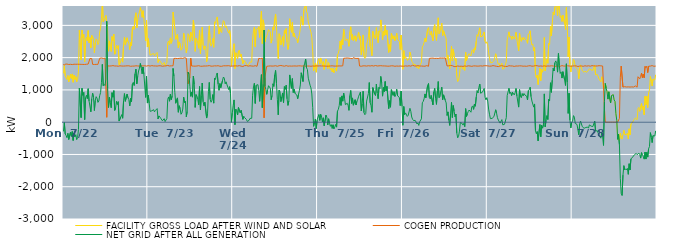
| Category | FACILITY GROSS LOAD AFTER WIND AND SOLAR | COGEN PRODUCTION | NET GRID AFTER ALL GENERATION |
|---|---|---|---|
|  Mon  7/22 | 1513 | 1799 | -286 |
|  Mon  7/22 | 1753 | 1766 | -13 |
|  Mon  7/22 | 1435 | 1798 | -363 |
|  Mon  7/22 | 1375 | 1789 | -414 |
|  Mon  7/22 | 1321 | 1801 | -480 |
|  Mon  7/22 | 1447 | 1792 | -345 |
|  Mon  7/22 | 1251 | 1787 | -536 |
|  Mon  7/22 | 1234 | 1789 | -555 |
|  Mon  7/22 | 1483 | 1793 | -310 |
|  Mon  7/22 | 1354 | 1793 | -439 |
|  Mon  7/22 | 1495 | 1785 | -290 |
|  Mon  7/22 | 1237 | 1804 | -567 |
|  Mon  7/22 | 1457 | 1796 | -339 |
|  Mon  7/22 | 1324 | 1780 | -456 |
|  Mon  7/22 | 1408 | 1794 | -386 |
|  Mon  7/22 | 1247 | 1789 | -542 |
|  Mon  7/22 | 1316 | 1796 | -480 |
|  Mon  7/22 | 1578 | 1802 | -224 |
|  Mon  7/22 | 2848 | 1794 | 1054 |
|  Mon  7/22 | 2853 | 1793 | 1060 |
|  Mon  7/22 | 1934 | 1792 | 142 |
|  Mon  7/22 | 2853 | 1804 | 1049 |
|  Mon  7/22 | 2622 | 1789 | 833 |
|  Mon  7/22 | 2720 | 1801 | 919 |
|  Mon  7/22 | 1869 | 1788 | 81 |
|  Mon  7/22 | 2543 | 1793 | 750 |
|  Mon  7/22 | 2630 | 1795 | 835 |
|  Mon  7/22 | 2523 | 1794 | 729 |
|  Mon  7/22 | 2838 | 1801 | 1037 |
|  Mon  7/22 | 2458 | 1804 | 654 |
|  Mon  7/22 | 2621 | 1974 | 647 |
|  Mon  7/22 | 2307 | 1985 | 322 |
|  Mon  7/22 | 2690 | 1972 | 718 |
|  Mon  7/22 | 2690 | 1792 | 898 |
|  Mon  7/22 | 2570 | 1797 | 773 |
|  Mon  7/22 | 2149 | 1788 | 361 |
|  Mon  7/22 | 2463 | 1785 | 678 |
|  Mon  7/22 | 2581 | 1791 | 790 |
|  Mon  7/22 | 2537 | 1794 | 743 |
|  Mon  7/22 | 2405 | 1791 | 614 |
|  Mon  7/22 | 2467 | 1813 | 654 |
|  Mon  7/22 | 2799 | 1979 | 820 |
|  Mon  7/22 | 2909 | 1992 | 917 |
|  Mon  7/22 | 3211 | 1990 | 1221 |
|  Mon  7/22 | 3782 | 1991 | 1791 |
|  Mon  7/22 | 3106 | 1976 | 1130 |
|  Mon  7/22 | 3150 | 1982 | 1168 |
|  Mon  7/22 | 3120 | 1984 | 1136 |
|  Mon  7/22 | 3306 | 1970 | 1336 |
|  Mon  7/22 | 3278 | 151 | 3127 |
|  Mon  7/22 | 2805 | 1746 | 1059 |
|  Mon  7/22 | 2199 | 1745 | 454 |
|  Mon  7/22 | 2518 | 1741 | 777 |
|  Mon  7/22 | 2359 | 1755 | 604 |
|  Mon  7/22 | 2191 | 1743 | 448 |
|  Mon  7/22 | 2653 | 1738 | 915 |
|  Mon  7/22 | 2527 | 1753 | 774 |
|  Mon  7/22 | 2727 | 1750 | 977 |
|  Mon  7/22 | 2106 | 1741 | 365 |
|  Mon  7/22 | 2172 | 1732 | 440 |
|  Mon  7/22 | 2382 | 1741 | 641 |
|  Mon  7/22 | 2286 | 1739 | 547 |
|  Mon  7/22 | 2372 | 1734 | 638 |
|  Mon  7/22 | 1775 | 1740 | 35 |
|  Mon  7/22 | 1778 | 1747 | 31 |
|  Mon  7/22 | 1903 | 1732 | 171 |
|  Mon  7/22 | 1976 | 1740 | 236 |
|  Mon  7/22 | 1859 | 1738 | 121 |
|  Mon  7/22 | 2398 | 1738 | 660 |
|  Mon  7/22 | 2629 | 1743 | 886 |
|  Mon  7/22 | 2388 | 1742 | 646 |
|  Mon  7/22 | 2384 | 1749 | 635 |
|  Mon  7/22 | 2615 | 1746 | 869 |
|  Mon  7/22 | 2497 | 1740 | 757 |
|  Mon  7/22 | 2449 | 1747 | 702 |
|  Mon  7/22 | 2249 | 1747 | 502 |
|  Mon  7/22 | 2468 | 1732 | 736 |
|  Mon  7/22 | 2372 | 1733 | 639 |
|  Mon  7/22 | 2915 | 1737 | 1178 |
|  Mon  7/22 | 2970 | 1737 | 1233 |
|  Mon  7/22 | 2875 | 1738 | 1137 |
|  Mon  7/22 | 3246 | 1746 | 1500 |
|  Mon  7/22 | 3391 | 1747 | 1644 |
|  Mon  7/22 | 2928 | 1739 | 1189 |
|  Mon  7/22 | 3165 | 1742 | 1423 |
|  Mon  7/22 | 3330 | 1744 | 1586 |
|  Mon  7/22 | 3412 | 1738 | 1674 |
|  Mon  7/22 | 3554 | 1734 | 1820 |
|  Mon  7/22 | 3434 | 1746 | 1688 |
|  Mon  7/22 | 3251 | 1751 | 1500 |
|  Mon  7/22 | 3454 | 1743 | 1711 |
|  Mon  7/22 | 3224 | 1738 | 1486 |
|  Mon  7/22 | 3236 | 1749 | 1487 |
|  Mon  7/22 | 2517 | 1749 | 768 |
|  Mon  7/22 | 3159 | 1737 | 1422 |
|  Mon  7/22 | 2329 | 1737 | 592 |
|  Tue  7/23 | 2589 | 1753 | 836 |
|  Tue  7/23 | 2331 | 1741 | 590 |
|  Tue  7/23 | 2074 | 1738 | 336 |
|  Tue  7/23 | 2100 | 1744 | 356 |
|  Tue  7/23 | 2106 | 1753 | 353 |
|  Tue  7/23 | 2092 | 1752 | 340 |
|  Tue  7/23 | 2130 | 1743 | 387 |
|  Tue  7/23 | 2055 | 1734 | 321 |
|  Tue  7/23 | 2104 | 1742 | 362 |
|  Tue  7/23 | 2123 | 1744 | 379 |
|  Tue  7/23 | 2159 | 1738 | 421 |
|  Tue  7/23 | 1848 | 1747 | 101 |
|  Tue  7/23 | 1942 | 1748 | 194 |
|  Tue  7/23 | 1936 | 1733 | 203 |
|  Tue  7/23 | 1870 | 1747 | 123 |
|  Tue  7/23 | 1841 | 1740 | 101 |
|  Tue  7/23 | 1776 | 1734 | 42 |
|  Tue  7/23 | 1775 | 1739 | 36 |
|  Tue  7/23 | 1850 | 1741 | 109 |
|  Tue  7/23 | 1750 | 1731 | 19 |
|  Tue  7/23 | 1767 | 1745 | 22 |
|  Tue  7/23 | 1849 | 1736 | 113 |
|  Tue  7/23 | 2464 | 1757 | 707 |
|  Tue  7/23 | 2515 | 1733 | 782 |
|  Tue  7/23 | 2390 | 1741 | 649 |
|  Tue  7/23 | 2612 | 1740 | 872 |
|  Tue  7/23 | 2444 | 1746 | 698 |
|  Tue  7/23 | 2538 | 1731 | 807 |
|  Tue  7/23 | 3414 | 1748 | 1666 |
|  Tue  7/23 | 3398 | 1975 | 1423 |
|  Tue  7/23 | 2893 | 1968 | 925 |
|  Tue  7/23 | 2563 | 1977 | 586 |
|  Tue  7/23 | 2586 | 1982 | 604 |
|  Tue  7/23 | 2723 | 1971 | 752 |
|  Tue  7/23 | 2298 | 1990 | 308 |
|  Tue  7/23 | 2487 | 1977 | 510 |
|  Tue  7/23 | 2414 | 1993 | 421 |
|  Tue  7/23 | 2229 | 1984 | 245 |
|  Tue  7/23 | 2266 | 1980 | 286 |
|  Tue  7/23 | 2383 | 1976 | 407 |
|  Tue  7/23 | 2757 | 1981 | 776 |
|  Tue  7/23 | 2606 | 1998 | 608 |
|  Tue  7/23 | 2626 | 1974 | 652 |
|  Tue  7/23 | 2149 | 1982 | 167 |
|  Tue  7/23 | 2307 | 1976 | 331 |
|  Tue  7/23 | 2740 | 1188 | 1552 |
|  Tue  7/23 | 2679 | 1191 | 1488 |
|  Tue  7/23 | 2498 | 1386 | 1112 |
|  Tue  7/23 | 2786 | 1985 | 801 |
|  Tue  7/23 | 2677 | 1741 | 936 |
|  Tue  7/23 | 2524 | 1748 | 776 |
|  Tue  7/23 | 3166 | 1737 | 1429 |
|  Tue  7/23 | 2917 | 1748 | 1169 |
|  Tue  7/23 | 2194 | 1736 | 458 |
|  Tue  7/23 | 2598 | 1741 | 857 |
|  Tue  7/23 | 2549 | 1740 | 809 |
|  Tue  7/23 | 2449 | 1740 | 709 |
|  Tue  7/23 | 2291 | 1751 | 540 |
|  Tue  7/23 | 2846 | 1742 | 1104 |
|  Tue  7/23 | 2116 | 1734 | 382 |
|  Tue  7/23 | 2573 | 1740 | 833 |
|  Tue  7/23 | 2948 | 1734 | 1214 |
|  Tue  7/23 | 2380 | 1747 | 633 |
|  Tue  7/23 | 2251 | 1741 | 510 |
|  Tue  7/23 | 2365 | 1748 | 617 |
|  Tue  7/23 | 2331 | 1740 | 591 |
|  Tue  7/23 | 1872 | 1744 | 128 |
|  Tue  7/23 | 2002 | 1744 | 258 |
|  Tue  7/23 | 2692 | 1751 | 941 |
|  Tue  7/23 | 2985 | 1753 | 1232 |
|  Tue  7/23 | 2464 | 1754 | 710 |
|  Tue  7/23 | 2354 | 1736 | 618 |
|  Tue  7/23 | 2424 | 1742 | 682 |
|  Tue  7/23 | 2592 | 1737 | 855 |
|  Tue  7/23 | 2321 | 1731 | 590 |
|  Tue  7/23 | 3109 | 1746 | 1363 |
|  Tue  7/23 | 3066 | 1742 | 1324 |
|  Tue  7/23 | 3189 | 1743 | 1446 |
|  Tue  7/23 | 3261 | 1737 | 1524 |
|  Tue  7/23 | 2933 | 1750 | 1183 |
|  Tue  7/23 | 2730 | 1743 | 987 |
|  Tue  7/23 | 2930 | 1734 | 1196 |
|  Tue  7/23 | 2816 | 1746 | 1070 |
|  Tue  7/23 | 2775 | 1732 | 1043 |
|  Tue  7/23 | 3038 | 1741 | 1297 |
|  Tue  7/23 | 3147 | 1747 | 1400 |
|  Tue  7/23 | 3115 | 1753 | 1362 |
|  Tue  7/23 | 2934 | 1747 | 1187 |
|  Tue  7/23 | 2987 | 1736 | 1251 |
|  Tue  7/23 | 2907 | 1747 | 1160 |
|  Tue  7/23 | 2820 | 1736 | 1084 |
|  Tue  7/23 | 2760 | 1751 | 1009 |
|  Tue  7/23 | 2853 | 1751 | 1102 |
|  Tue  7/23 | 2635 | 1736 | 899 |
|  Tue  7/23 | 1738 | 1739 | -1 |
|  Tue  7/23 | 2020 | 1739 | 281 |
|  Wed  7/24 | 2258 | 1746 | 512 |
|  Wed  7/24 | 2432 | 1742 | 690 |
|  Wed  7/24 | 1664 | 1742 | -78 |
|  Wed  7/24 | 2151 | 1745 | 406 |
|  Wed  7/24 | 2087 | 1732 | 355 |
|  Wed  7/24 | 1963 | 1740 | 223 |
|  Wed  7/24 | 2199 | 1745 | 454 |
|  Wed  7/24 | 2234 | 1752 | 482 |
|  Wed  7/24 | 2029 | 1740 | 289 |
|  Wed  7/24 | 2107 | 1736 | 371 |
|  Wed  7/24 | 2135 | 1740 | 395 |
|  Wed  7/24 | 1814 | 1726 | 88 |
|  Wed  7/24 | 1915 | 1734 | 181 |
|  Wed  7/24 | 1893 | 1752 | 141 |
|  Wed  7/24 | 1859 | 1742 | 117 |
|  Wed  7/24 | 1838 | 1754 | 84 |
|  Wed  7/24 | 1751 | 1728 | 23 |
|  Wed  7/24 | 1746 | 1737 | 9 |
|  Wed  7/24 | 1805 | 1749 | 56 |
|  Wed  7/24 | 1864 | 1748 | 116 |
|  Wed  7/24 | 1852 | 1738 | 114 |
|  Wed  7/24 | 1861 | 1740 | 121 |
|  Wed  7/24 | 2573 | 1738 | 835 |
|  Wed  7/24 | 2827 | 1736 | 1091 |
|  Wed  7/24 | 2942 | 1737 | 1205 |
|  Wed  7/24 | 2332 | 1751 | 581 |
|  Wed  7/24 | 2881 | 1738 | 1143 |
|  Wed  7/24 | 2876 | 1731 | 1145 |
|  Wed  7/24 | 2901 | 1738 | 1163 |
|  Wed  7/24 | 2960 | 1978 | 982 |
|  Wed  7/24 | 2628 | 1982 | 646 |
|  Wed  7/24 | 2618 | 1968 | 650 |
|  Wed  7/24 | 3442 | 1970 | 1472 |
|  Wed  7/24 | 2436 | 1986 | 450 |
|  Wed  7/24 | 3172 | 1997 | 1175 |
|  Wed  7/24 | 2990 | 134 | 2856 |
|  Wed  7/24 | 2489 | 1383 | 1106 |
|  Wed  7/24 | 2609 | 1586 | 1023 |
|  Wed  7/24 | 2595 | 1732 | 863 |
|  Wed  7/24 | 2747 | 1747 | 1000 |
|  Wed  7/24 | 2868 | 1738 | 1130 |
|  Wed  7/24 | 2890 | 1756 | 1134 |
|  Wed  7/24 | 2798 | 1743 | 1055 |
|  Wed  7/24 | 2450 | 1754 | 696 |
|  Wed  7/24 | 2565 | 1738 | 827 |
|  Wed  7/24 | 2946 | 1757 | 1189 |
|  Wed  7/24 | 2850 | 1740 | 1110 |
|  Wed  7/24 | 3212 | 1749 | 1463 |
|  Wed  7/24 | 3353 | 1749 | 1604 |
|  Wed  7/24 | 2928 | 1731 | 1197 |
|  Wed  7/24 | 2444 | 1733 | 711 |
|  Wed  7/24 | 1968 | 1740 | 228 |
|  Wed  7/24 | 2742 | 1750 | 992 |
|  Wed  7/24 | 2692 | 1749 | 943 |
|  Wed  7/24 | 2393 | 1757 | 636 |
|  Wed  7/24 | 2529 | 1746 | 783 |
|  Wed  7/24 | 2651 | 1745 | 906 |
|  Wed  7/24 | 2353 | 1745 | 608 |
|  Wed  7/24 | 2837 | 1735 | 1102 |
|  Wed  7/24 | 2750 | 1731 | 1019 |
|  Wed  7/24 | 2900 | 1753 | 1147 |
|  Wed  7/24 | 2473 | 1750 | 723 |
|  Wed  7/24 | 2255 | 1735 | 520 |
|  Wed  7/24 | 2410 | 1750 | 660 |
|  Wed  7/24 | 3205 | 1741 | 1464 |
|  Wed  7/24 | 3217 | 1735 | 1482 |
|  Wed  7/24 | 2787 | 1737 | 1050 |
|  Wed  7/24 | 3094 | 1743 | 1351 |
|  Wed  7/24 | 2661 | 1741 | 920 |
|  Wed  7/24 | 2761 | 1741 | 1020 |
|  Wed  7/24 | 2633 | 1742 | 891 |
|  Wed  7/24 | 2647 | 1740 | 907 |
|  Wed  7/24 | 2581 | 1738 | 843 |
|  Wed  7/24 | 2460 | 1734 | 726 |
|  Wed  7/24 | 2614 | 1746 | 868 |
|  Wed  7/24 | 2727 | 1742 | 985 |
|  Wed  7/24 | 2899 | 1745 | 1154 |
|  Wed  7/24 | 3280 | 1748 | 1532 |
|  Wed  7/24 | 3282 | 1737 | 1545 |
|  Wed  7/24 | 3006 | 1745 | 1261 |
|  Wed  7/24 | 3481 | 1751 | 1730 |
|  Wed  7/24 | 3581 | 1751 | 1830 |
|  Wed  7/24 | 3686 | 1730 | 1956 |
|  Wed  7/24 | 3422 | 1736 | 1686 |
|  Wed  7/24 | 3372 | 1739 | 1633 |
|  Wed  7/24 | 3110 | 1746 | 1364 |
|  Wed  7/24 | 3082 | 1739 | 1343 |
|  Wed  7/24 | 2885 | 1739 | 1146 |
|  Wed  7/24 | 2795 | 1733 | 1062 |
|  Wed  7/24 | 2625 | 1751 | 874 |
|  Wed  7/24 | 2193 | 1741 | 452 |
|  Wed  7/24 | 1595 | 1723 | -128 |
|  Wed  7/24 | 1727 | 1738 | -11 |
|  Wed  7/24 | 1836 | 1741 | 95 |
|  Wed  7/24 | 1548 | 1745 | -197 |
|  Wed  7/24 | 1800 | 1736 | 64 |
|  Thu  7/25 | 1906 | 1741 | 165 |
|  Thu  7/25 | 1973 | 1737 | 236 |
|  Thu  7/25 | 1801 | 1745 | 56 |
|  Thu  7/25 | 1990 | 1748 | 242 |
|  Thu  7/25 | 1895 | 1741 | 154 |
|  Thu  7/25 | 1747 | 1742 | 5 |
|  Thu  7/25 | 1877 | 1741 | 136 |
|  Thu  7/25 | 1637 | 1749 | -112 |
|  Thu  7/25 | 1642 | 1738 | -96 |
|  Thu  7/25 | 1957 | 1738 | 219 |
|  Thu  7/25 | 1890 | 1735 | 155 |
|  Thu  7/25 | 1662 | 1748 | -86 |
|  Thu  7/25 | 1842 | 1736 | 106 |
|  Thu  7/25 | 1720 | 1750 | -30 |
|  Thu  7/25 | 1614 | 1742 | -128 |
|  Thu  7/25 | 1680 | 1756 | -76 |
|  Thu  7/25 | 1555 | 1747 | -192 |
|  Thu  7/25 | 1666 | 1747 | -81 |
|  Thu  7/25 | 1533 | 1739 | -206 |
|  Thu  7/25 | 1601 | 1754 | -153 |
|  Thu  7/25 | 1670 | 1738 | -68 |
|  Thu  7/25 | 1582 | 1736 | -154 |
|  Thu  7/25 | 2082 | 1740 | 342 |
|  Thu  7/25 | 2139 | 1740 | 399 |
|  Thu  7/25 | 2259 | 1744 | 515 |
|  Thu  7/25 | 2513 | 1745 | 768 |
|  Thu  7/25 | 2261 | 1741 | 520 |
|  Thu  7/25 | 2554 | 1740 | 814 |
|  Thu  7/25 | 2398 | 1747 | 651 |
|  Thu  7/25 | 2880 | 1979 | 901 |
|  Thu  7/25 | 2725 | 1982 | 743 |
|  Thu  7/25 | 2527 | 1984 | 543 |
|  Thu  7/25 | 2546 | 1977 | 569 |
|  Thu  7/25 | 2575 | 1989 | 586 |
|  Thu  7/25 | 2514 | 1989 | 525 |
|  Thu  7/25 | 2351 | 1984 | 367 |
|  Thu  7/25 | 2793 | 1967 | 826 |
|  Thu  7/25 | 2957 | 1975 | 982 |
|  Thu  7/25 | 2562 | 1980 | 582 |
|  Thu  7/25 | 2719 | 1967 | 752 |
|  Thu  7/25 | 2526 | 2000 | 526 |
|  Thu  7/25 | 2500 | 1980 | 520 |
|  Thu  7/25 | 2675 | 1978 | 697 |
|  Thu  7/25 | 2509 | 1975 | 534 |
|  Thu  7/25 | 2623 | 1975 | 648 |
|  Thu  7/25 | 2697 | 1985 | 712 |
|  Thu  7/25 | 2783 | 1978 | 805 |
|  Thu  7/25 | 2569 | 1740 | 829 |
|  Thu  7/25 | 2669 | 1735 | 934 |
|  Thu  7/25 | 2083 | 1733 | 350 |
|  Thu  7/25 | 2318 | 1745 | 573 |
|  Thu  7/25 | 2704 | 1746 | 958 |
|  Thu  7/25 | 2043 | 1744 | 299 |
|  Thu  7/25 | 1978 | 1746 | 232 |
|  Thu  7/25 | 2012 | 1744 | 268 |
|  Thu  7/25 | 2392 | 1738 | 654 |
|  Thu  7/25 | 2408 | 1751 | 657 |
|  Thu  7/25 | 2638 | 1750 | 888 |
|  Thu  7/25 | 2956 | 1728 | 1228 |
|  Thu  7/25 | 2344 | 1741 | 603 |
|  Thu  7/25 | 2252 | 1741 | 511 |
|  Thu  7/25 | 2060 | 1752 | 308 |
|  Thu  7/25 | 2813 | 1741 | 1072 |
|  Thu  7/25 | 2790 | 1739 | 1051 |
|  Thu  7/25 | 2615 | 1740 | 875 |
|  Thu  7/25 | 2579 | 1756 | 823 |
|  Thu  7/25 | 2929 | 1752 | 1177 |
|  Thu  7/25 | 2635 | 1741 | 894 |
|  Thu  7/25 | 2461 | 1734 | 727 |
|  Thu  7/25 | 2827 | 1746 | 1081 |
|  Thu  7/25 | 2793 | 1755 | 1038 |
|  Thu  7/25 | 3169 | 1751 | 1418 |
|  Thu  7/25 | 2956 | 1734 | 1222 |
|  Thu  7/25 | 2550 | 1744 | 806 |
|  Thu  7/25 | 2811 | 1736 | 1075 |
|  Thu  7/25 | 2688 | 1743 | 945 |
|  Thu  7/25 | 2997 | 1736 | 1261 |
|  Thu  7/25 | 2710 | 1740 | 970 |
|  Thu  7/25 | 2849 | 1740 | 1109 |
|  Thu  7/25 | 2830 | 1735 | 1095 |
|  Thu  7/25 | 2163 | 1740 | 423 |
|  Thu  7/25 | 2404 | 1737 | 667 |
|  Thu  7/25 | 2196 | 1732 | 464 |
|  Thu  7/25 | 2755 | 1747 | 1008 |
|  Thu  7/25 | 2740 | 1738 | 1002 |
|  Thu  7/25 | 2574 | 1745 | 829 |
|  Thu  7/25 | 2674 | 1729 | 945 |
|  Thu  7/25 | 2528 | 1732 | 796 |
|  Thu  7/25 | 2606 | 1742 | 864 |
|  Thu  7/25 | 2760 | 1740 | 1020 |
|  Thu  7/25 | 2558 | 1741 | 817 |
|  Thu  7/25 | 2567 | 1736 | 831 |
|  Thu  7/25 | 2508 | 1740 | 768 |
|  Thu  7/25 | 2253 | 1741 | 512 |
|  Thu  7/25 | 2699 | 1735 | 964 |
|  Thu  7/25 | 2226 | 1736 | 490 |
|  Fri  7/26 | 1641 | 1737 | -96 |
|  Fri  7/26 | 2219 | 1734 | 485 |
|  Fri  7/26 | 1971 | 1737 | 234 |
|  Fri  7/26 | 2032 | 1744 | 288 |
|  Fri  7/26 | 2007 | 1742 | 265 |
|  Fri  7/26 | 1916 | 1737 | 179 |
|  Fri  7/26 | 1937 | 1727 | 210 |
|  Fri  7/26 | 1957 | 1748 | 209 |
|  Fri  7/26 | 2172 | 1742 | 430 |
|  Fri  7/26 | 2073 | 1736 | 337 |
|  Fri  7/26 | 1890 | 1730 | 160 |
|  Fri  7/26 | 1852 | 1764 | 88 |
|  Fri  7/26 | 1789 | 1736 | 53 |
|  Fri  7/26 | 1802 | 1743 | 59 |
|  Fri  7/26 | 1790 | 1736 | 54 |
|  Fri  7/26 | 1775 | 1741 | 34 |
|  Fri  7/26 | 1678 | 1734 | -56 |
|  Fri  7/26 | 1728 | 1752 | -24 |
|  Fri  7/26 | 1655 | 1755 | -100 |
|  Fri  7/26 | 1752 | 1741 | 11 |
|  Fri  7/26 | 1749 | 1746 | 3 |
|  Fri  7/26 | 1844 | 1740 | 104 |
|  Fri  7/26 | 2336 | 1734 | 602 |
|  Fri  7/26 | 2377 | 1736 | 641 |
|  Fri  7/26 | 2471 | 1747 | 724 |
|  Fri  7/26 | 2609 | 1734 | 875 |
|  Fri  7/26 | 2495 | 1738 | 757 |
|  Fri  7/26 | 2504 | 1753 | 751 |
|  Fri  7/26 | 2875 | 1736 | 1139 |
|  Fri  7/26 | 2931 | 1732 | 1199 |
|  Fri  7/26 | 2740 | 1976 | 764 |
|  Fri  7/26 | 2702 | 1982 | 720 |
|  Fri  7/26 | 2814 | 1983 | 831 |
|  Fri  7/26 | 2808 | 1981 | 827 |
|  Fri  7/26 | 2524 | 1985 | 539 |
|  Fri  7/26 | 2924 | 1985 | 939 |
|  Fri  7/26 | 3024 | 1976 | 1048 |
|  Fri  7/26 | 2717 | 1978 | 739 |
|  Fri  7/26 | 2530 | 1979 | 551 |
|  Fri  7/26 | 2964 | 1998 | 966 |
|  Fri  7/26 | 3235 | 1975 | 1260 |
|  Fri  7/26 | 2737 | 1978 | 759 |
|  Fri  7/26 | 2784 | 1988 | 796 |
|  Fri  7/26 | 2951 | 1971 | 980 |
|  Fri  7/26 | 3070 | 1986 | 1084 |
|  Fri  7/26 | 2687 | 1991 | 696 |
|  Fri  7/26 | 2835 | 1987 | 848 |
|  Fri  7/26 | 2827 | 2003 | 824 |
|  Fri  7/26 | 2666 | 1992 | 674 |
|  Fri  7/26 | 2582 | 1986 | 596 |
|  Fri  7/26 | 1950 | 1742 | 208 |
|  Fri  7/26 | 2072 | 1753 | 319 |
|  Fri  7/26 | 1806 | 1746 | 60 |
|  Fri  7/26 | 1653 | 1753 | -100 |
|  Fri  7/26 | 2029 | 1757 | 272 |
|  Fri  7/26 | 2361 | 1747 | 614 |
|  Fri  7/26 | 1895 | 1750 | 145 |
|  Fri  7/26 | 2265 | 1749 | 516 |
|  Fri  7/26 | 2066 | 1724 | 342 |
|  Fri  7/26 | 1911 | 1742 | 169 |
|  Fri  7/26 | 1973 | 1723 | 250 |
|  Fri  7/26 | 1415 | 1748 | -333 |
|  Fri  7/26 | 1258 | 1742 | -484 |
|  Fri  7/26 | 1293 | 1735 | -442 |
|  Fri  7/26 | 1455 | 1732 | -277 |
|  Fri  7/26 | 1734 | 1745 | -11 |
|  Fri  7/26 | 1716 | 1735 | -19 |
|  Fri  7/26 | 1704 | 1742 | -38 |
|  Fri  7/26 | 1638 | 1729 | -91 |
|  Fri  7/26 | 1702 | 1737 | -35 |
|  Fri  7/26 | 1604 | 1743 | -139 |
|  Fri  7/26 | 2168 | 1748 | 420 |
|  Fri  7/26 | 1909 | 1731 | 178 |
|  Fri  7/26 | 2017 | 1751 | 266 |
|  Fri  7/26 | 2080 | 1747 | 333 |
|  Fri  7/26 | 2122 | 1745 | 377 |
|  Fri  7/26 | 2144 | 1740 | 404 |
|  Fri  7/26 | 2053 | 1744 | 309 |
|  Fri  7/26 | 2202 | 1730 | 472 |
|  Fri  7/26 | 2244 | 1740 | 504 |
|  Fri  7/26 | 2141 | 1744 | 397 |
|  Fri  7/26 | 2306 | 1742 | 564 |
|  Fri  7/26 | 2236 | 1743 | 493 |
|  Fri  7/26 | 2512 | 1734 | 778 |
|  Fri  7/26 | 2714 | 1737 | 977 |
|  Fri  7/26 | 2660 | 1753 | 907 |
|  Fri  7/26 | 2814 | 1738 | 1076 |
|  Fri  7/26 | 2924 | 1744 | 1180 |
|  Fri  7/26 | 2644 | 1746 | 898 |
|  Fri  7/26 | 2644 | 1743 | 901 |
|  Fri  7/26 | 2667 | 1738 | 929 |
|  Fri  7/26 | 2657 | 1747 | 910 |
|  Fri  7/26 | 2796 | 1750 | 1046 |
|  Fri  7/26 | 2506 | 1735 | 771 |
|  Fri  7/26 | 2441 | 1750 | 691 |
|  Fri  7/26 | 2493 | 1732 | 761 |
|  Sat  7/27 | 2399 | 1745 | 654 |
|  Sat  7/27 | 2155 | 1748 | 407 |
|  Sat  7/27 | 1983 | 1736 | 247 |
|  Sat  7/27 | 1845 | 1736 | 109 |
|  Sat  7/27 | 1847 | 1738 | 109 |
|  Sat  7/27 | 1849 | 1730 | 119 |
|  Sat  7/27 | 1858 | 1753 | 105 |
|  Sat  7/27 | 1903 | 1732 | 171 |
|  Sat  7/27 | 1905 | 1743 | 162 |
|  Sat  7/27 | 2120 | 1735 | 385 |
|  Sat  7/27 | 2005 | 1731 | 274 |
|  Sat  7/27 | 1884 | 1745 | 139 |
|  Sat  7/27 | 1788 | 1723 | 65 |
|  Sat  7/27 | 1819 | 1736 | 83 |
|  Sat  7/27 | 1715 | 1744 | -29 |
|  Sat  7/27 | 1704 | 1739 | -35 |
|  Sat  7/27 | 1830 | 1750 | 80 |
|  Sat  7/27 | 1643 | 1726 | -83 |
|  Sat  7/27 | 1630 | 1737 | -107 |
|  Sat  7/27 | 1674 | 1739 | -65 |
|  Sat  7/27 | 1693 | 1728 | -35 |
|  Sat  7/27 | 1891 | 1750 | 141 |
|  Sat  7/27 | 2552 | 1727 | 825 |
|  Sat  7/27 | 2523 | 1727 | 796 |
|  Sat  7/27 | 2799 | 1750 | 1049 |
|  Sat  7/27 | 2634 | 1744 | 890 |
|  Sat  7/27 | 2668 | 1743 | 925 |
|  Sat  7/27 | 2565 | 1742 | 823 |
|  Sat  7/27 | 2668 | 1741 | 927 |
|  Sat  7/27 | 2647 | 1740 | 907 |
|  Sat  7/27 | 2573 | 1728 | 845 |
|  Sat  7/27 | 2657 | 1744 | 913 |
|  Sat  7/27 | 2785 | 1741 | 1044 |
|  Sat  7/27 | 2559 | 1747 | 812 |
|  Sat  7/27 | 2573 | 1739 | 834 |
|  Sat  7/27 | 2213 | 1746 | 467 |
|  Sat  7/27 | 2754 | 1746 | 1008 |
|  Sat  7/27 | 2560 | 1749 | 811 |
|  Sat  7/27 | 2501 | 1744 | 757 |
|  Sat  7/27 | 2623 | 1734 | 889 |
|  Sat  7/27 | 2545 | 1735 | 810 |
|  Sat  7/27 | 2626 | 1738 | 888 |
|  Sat  7/27 | 2581 | 1737 | 844 |
|  Sat  7/27 | 2593 | 1739 | 854 |
|  Sat  7/27 | 2538 | 1732 | 806 |
|  Sat  7/27 | 2445 | 1758 | 687 |
|  Sat  7/27 | 2724 | 1745 | 979 |
|  Sat  7/27 | 2757 | 1746 | 1011 |
|  Sat  7/27 | 2832 | 1750 | 1082 |
|  Sat  7/27 | 2536 | 1744 | 792 |
|  Sat  7/27 | 2390 | 1735 | 655 |
|  Sat  7/27 | 2424 | 1750 | 674 |
|  Sat  7/27 | 2205 | 1738 | 467 |
|  Sat  7/27 | 2312 | 1747 | 565 |
|  Sat  7/27 | 1489 | 1752 | -263 |
|  Sat  7/27 | 1380 | 1739 | -359 |
|  Sat  7/27 | 1459 | 1749 | -290 |
|  Sat  7/27 | 1167 | 1745 | -578 |
|  Sat  7/27 | 1171 | 1735 | -564 |
|  Sat  7/27 | 1668 | 1743 | -75 |
|  Sat  7/27 | 1287 | 1742 | -455 |
|  Sat  7/27 | 1642 | 1733 | -91 |
|  Sat  7/27 | 1549 | 1735 | -186 |
|  Sat  7/27 | 1627 | 1747 | -120 |
|  Sat  7/27 | 2623 | 1746 | 877 |
|  Sat  7/27 | 1594 | 1737 | -143 |
|  Sat  7/27 | 1792 | 1734 | 58 |
|  Sat  7/27 | 1943 | 1740 | 203 |
|  Sat  7/27 | 1827 | 1743 | 84 |
|  Sat  7/27 | 2444 | 1734 | 710 |
|  Sat  7/27 | 2400 | 1739 | 661 |
|  Sat  7/27 | 2972 | 1750 | 1222 |
|  Sat  7/27 | 2671 | 1747 | 924 |
|  Sat  7/27 | 3052 | 1749 | 1303 |
|  Sat  7/27 | 3409 | 1742 | 1667 |
|  Sat  7/27 | 3327 | 1741 | 1586 |
|  Sat  7/27 | 3568 | 1727 | 1841 |
|  Sat  7/27 | 3629 | 1730 | 1899 |
|  Sat  7/27 | 3552 | 1738 | 1814 |
|  Sat  7/27 | 3304 | 1753 | 1551 |
|  Sat  7/27 | 3866 | 1737 | 2129 |
|  Sat  7/27 | 3502 | 1748 | 1754 |
|  Sat  7/27 | 3243 | 1733 | 1510 |
|  Sat  7/27 | 3299 | 1741 | 1558 |
|  Sat  7/27 | 3120 | 1753 | 1367 |
|  Sat  7/27 | 3316 | 1751 | 1565 |
|  Sat  7/27 | 3326 | 1739 | 1587 |
|  Sat  7/27 | 3052 | 1745 | 1307 |
|  Sat  7/27 | 2877 | 1739 | 1138 |
|  Sat  7/27 | 3554 | 1745 | 1809 |
|  Sat  7/27 | 2990 | 1746 | 1244 |
|  Sat  7/27 | 2026 | 1755 | 271 |
|  Sat  7/27 | 2638 | 1742 | 896 |
|  Sat  7/27 | 1800 | 1733 | 67 |
|  Sat  7/27 | 1556 | 1734 | -178 |
|  Sat  7/27 | 1742 | 1743 | -1 |
|  Sun  7/28 | 1773 | 1741 | 32 |
|  Sun  7/28 | 1949 | 1745 | 204 |
|  Sun  7/28 | 1901 | 1745 | 156 |
|  Sun  7/28 | 1709 | 1749 | -40 |
|  Sun  7/28 | 1709 | 1744 | -35 |
|  Sun  7/28 | 1666 | 1736 | -70 |
|  Sun  7/28 | 1633 | 1724 | -91 |
|  Sun  7/28 | 1349 | 1738 | -389 |
|  Sun  7/28 | 1680 | 1739 | -59 |
|  Sun  7/28 | 1776 | 1741 | 35 |
|  Sun  7/28 | 1750 | 1743 | 7 |
|  Sun  7/28 | 1595 | 1735 | -140 |
|  Sun  7/28 | 1575 | 1731 | -156 |
|  Sun  7/28 | 1545 | 1734 | -189 |
|  Sun  7/28 | 1580 | 1748 | -168 |
|  Sun  7/28 | 1577 | 1741 | -164 |
|  Sun  7/28 | 1545 | 1737 | -192 |
|  Sun  7/28 | 1581 | 1732 | -151 |
|  Sun  7/28 | 1562 | 1747 | -185 |
|  Sun  7/28 | 1652 | 1737 | -85 |
|  Sun  7/28 | 1650 | 1735 | -85 |
|  Sun  7/28 | 1618 | 1741 | -123 |
|  Sun  7/28 | 1604 | 1752 | -148 |
|  Sun  7/28 | 1609 | 1743 | -134 |
|  Sun  7/28 | 1611 | 1744 | -133 |
|  Sun  7/28 | 1771 | 1737 | 34 |
|  Sun  7/28 | 1467 | 1741 | -274 |
|  Sun  7/28 | 1450 | 1753 | -303 |
|  Sun  7/28 | 1477 | 1742 | -265 |
|  Sun  7/28 | 1484 | 1727 | -243 |
|  Sun  7/28 | 1334 | 1751 | -417 |
|  Sun  7/28 | 1313 | 1743 | -430 |
|  Sun  7/28 | 1250 | 1746 | -496 |
|  Sun  7/28 | 1407 | 1738 | -331 |
|  Sun  7/28 | 1299 | 1740 | -441 |
|  Sun  7/28 | 1030 | 1750 | -720 |
|  Sun  7/28 | 1067 | 432 | 635 |
|  Sun  7/28 | 1201 | 0 | 1201 |
|  Sun  7/28 | 1046 | 0 | 1046 |
|  Sun  7/28 | 944 | 0 | 944 |
|  Sun  7/28 | 715 | 0 | 715 |
|  Sun  7/28 | 941 | 0 | 941 |
|  Sun  7/28 | 709 | 0 | 709 |
|  Sun  7/28 | 596 | 0 | 596 |
|  Sun  7/28 | 823 | 0 | 823 |
|  Sun  7/28 | 799 | 0 | 799 |
|  Sun  7/28 | 852 | 0 | 852 |
|  Sun  7/28 | 690 | 0 | 690 |
|  Sun  7/28 | 641 | 0 | 641 |
|  Sun  7/28 | 265 | 0 | 265 |
|  Sun  7/28 | 53 | 0 | 53 |
|  Sun  7/28 | -532 | 0 | -532 |
|  Sun  7/28 | -370 | 0 | -370 |
|  Sun  7/28 | -580 | 119 | -699 |
|  Sun  7/28 | -343 | 1394 | -1737 |
|  Sun  7/28 | -471 | 1737 | -2208 |
|  Sun  7/28 | -524 | 1746 | -2270 |
|  Sun  7/28 | -551 | 1088 | -1639 |
|  Sun  7/28 | -252 | 1095 | -1347 |
|  Sun  7/28 | -376 | 1100 | -1476 |
|  Sun  7/28 | -349 | 1096 | -1445 |
|  Sun  7/28 | -389 | 1090 | -1479 |
|  Sun  7/28 | -340 | 1092 | -1432 |
|  Sun  7/28 | -522 | 1094 | -1616 |
|  Sun  7/28 | -205 | 1082 | -1287 |
|  Sun  7/28 | -391 | 1089 | -1480 |
|  Sun  7/28 | -57 | 1082 | -1139 |
|  Sun  7/28 | -62 | 1094 | -1156 |
|  Sun  7/28 | 8 | 1087 | -1079 |
|  Sun  7/28 | -12 | 1089 | -1101 |
|  Sun  7/28 | 93 | 1101 | -1008 |
|  Sun  7/28 | 130 | 1124 | -994 |
|  Sun  7/28 | 153 | 1122 | -969 |
|  Sun  7/28 | 78 | 1086 | -1008 |
|  Sun  7/28 | 418 | 1408 | -990 |
|  Sun  7/28 | 459 | 1417 | -958 |
|  Sun  7/28 | 336 | 1341 | -1005 |
|  Sun  7/28 | 308 | 1421 | -1113 |
|  Sun  7/28 | 579 | 1521 | -942 |
|  Sun  7/28 | 384 | 1377 | -993 |
|  Sun  7/28 | 492 | 1492 | -1000 |
|  Sun  7/28 | 231 | 1376 | -1145 |
|  Sun  7/28 | 807 | 1731 | -924 |
|  Sun  7/28 | 541 | 1684 | -1143 |
|  Sun  7/28 | 803 | 1737 | -934 |
|  Sun  7/28 | 454 | 1536 | -1082 |
|  Sun  7/28 | 911 | 1733 | -822 |
|  Sun  7/28 | 998 | 1752 | -754 |
|  Sun  7/28 | 1414 | 1738 | -324 |
|  Sun  7/28 | 1275 | 1735 | -460 |
|  Sun  7/28 | 1121 | 1753 | -632 |
|  Sun  7/28 | 1331 | 1748 | -417 |
|  Sun  7/28 | 1342 | 1732 | -390 |
|  Sun  7/28 | 1309 | 1738 | -429 |
|  Sun  7/28 | 1470 | 1738 | -268 |
|  Sun  7/28 | 1442 | 1728 | -286 |